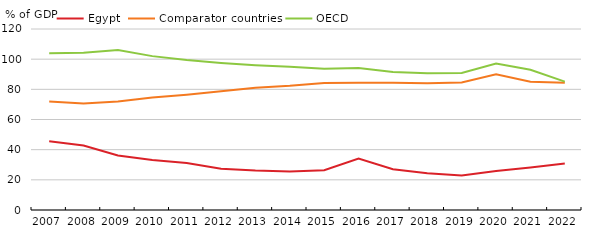
| Category | Egypt | Comparator countries | OECD |
|---|---|---|---|
| 2007.0 | 45.515 | 71.986 | 103.991 |
| 2008.0 | 42.798 | 70.587 | 104.328 |
| 2009.0 | 36.093 | 71.938 | 106.053 |
| 2010.0 | 33.072 | 74.543 | 102.015 |
| 2011.0 | 31.155 | 76.485 | 99.382 |
| 2012.0 | 27.388 | 78.752 | 97.463 |
| 2013.0 | 26.222 | 81.099 | 96.015 |
| 2014.0 | 25.607 | 82.327 | 94.946 |
| 2015.0 | 26.316 | 84.16 | 93.701 |
| 2016.0 | 34.135 | 84.44 | 94.123 |
| 2017.0 | 27.07 | 84.426 | 91.567 |
| 2018.0 | 24.295 | 84.088 | 90.643 |
| 2019.0 | 22.849 | 84.508 | 90.81 |
| 2020.0 | 25.789 | 89.928 | 97.127 |
| 2021.0 | 28.231 | 84.972 | 92.963 |
| 2022.0 | 30.847 | 84.308 | 85.092 |